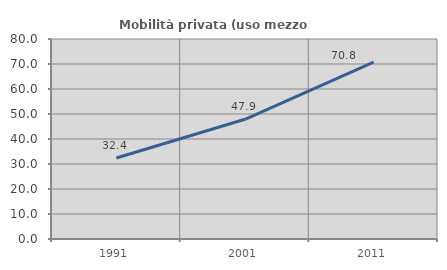
| Category | Mobilità privata (uso mezzo privato) |
|---|---|
| 1991.0 | 32.381 |
| 2001.0 | 47.895 |
| 2011.0 | 70.779 |